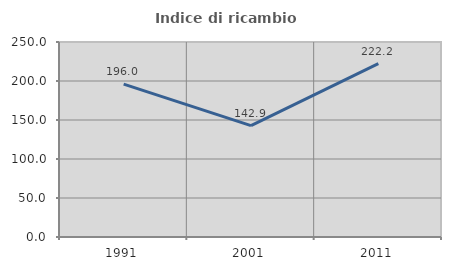
| Category | Indice di ricambio occupazionale  |
|---|---|
| 1991.0 | 196 |
| 2001.0 | 142.857 |
| 2011.0 | 222.222 |